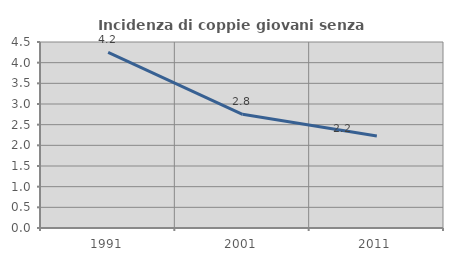
| Category | Incidenza di coppie giovani senza figli |
|---|---|
| 1991.0 | 4.249 |
| 2001.0 | 2.751 |
| 2011.0 | 2.227 |